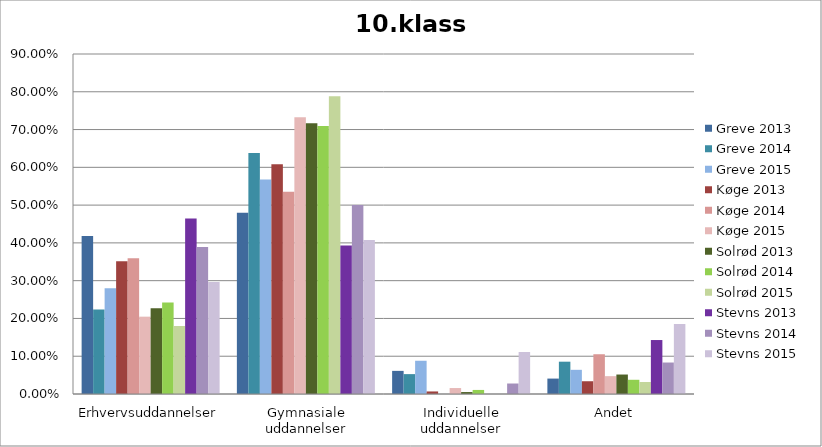
| Category | Greve 2013 | Greve 2014 | Greve 2015 | Køge 2013 | Køge 2014 | Køge 2015 | Solrød 2013 | Solrød 2014 | Solrød 2015 | Stevns 2013 | Stevns 2014 | Stevns 2015 |
|---|---|---|---|---|---|---|---|---|---|---|---|---|
| Erhvervsuddannelser | 0.418 | 0.224 | 0.28 | 0.351 | 0.36 | 0.205 | 0.227 | 0.242 | 0.18 | 0.464 | 0.389 | 0.296 |
| Gymnasiale uddannelser | 0.48 | 0.638 | 0.568 | 0.608 | 0.535 | 0.732 | 0.716 | 0.71 | 0.788 | 0.393 | 0.5 | 0.407 |
| Individuelle uddannelser | 0.061 | 0.053 | 0.088 | 0.007 | 0 | 0.016 | 0.005 | 0.011 | 0 | 0 | 0.028 | 0.111 |
| Andet | 0.041 | 0.086 | 0.064 | 0.034 | 0.105 | 0.047 | 0.052 | 0.038 | 0.032 | 0.143 | 0.083 | 0.185 |